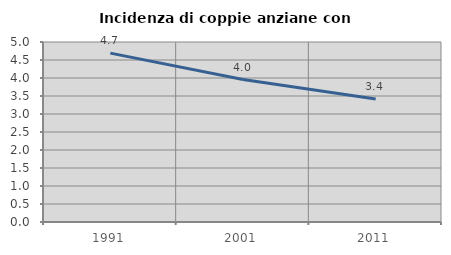
| Category | Incidenza di coppie anziane con figli |
|---|---|
| 1991.0 | 4.691 |
| 2001.0 | 3.958 |
| 2011.0 | 3.419 |